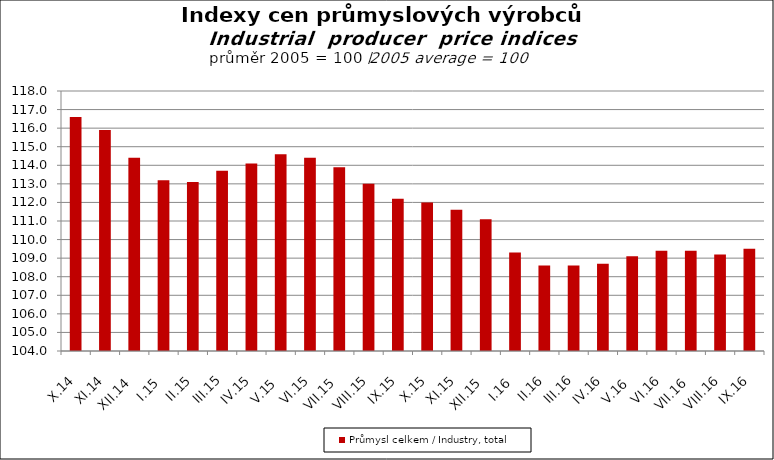
| Category | Průmysl celkem / Industry, total |
|---|---|
| X.14 | 116.6 |
| XI.14 | 115.9 |
| XII.14 | 114.4 |
| I.15 | 113.2 |
| II.15 | 113.1 |
| III.15 | 113.7 |
| IV.15 | 114.1 |
| V.15 | 114.6 |
| VI.15 | 114.4 |
| VII.15 | 113.9 |
| VIII.15 | 113 |
| IX.15 | 112.2 |
| X.15 | 112 |
| XI.15 | 111.6 |
| XII.15 | 111.1 |
| I.16 | 109.3 |
| II.16 | 108.6 |
| III.16 | 108.6 |
| IV.16 | 108.7 |
| V.16 | 109.1 |
| VI.16 | 109.4 |
| VII.16 | 109.4 |
| VIII.16 | 109.2 |
| IX.16 | 109.5 |